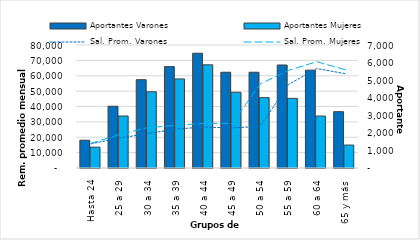
| Category | Aportantes Varones | Aportantes Mujeres |
|---|---|---|
| Hasta 24 | 1581 | 1187 |
| 25 a 29 | 3515 | 2960 |
| 30 a 34 | 5026 | 4337 |
| 35 a 39 | 5770 | 5069 |
| 40 a 44 | 6532 | 5872 |
| 45 a 49 | 5449 | 4311 |
| 50 a 54 | 5450 | 4003 |
| 55 a 59 | 5861 | 3963 |
| 60 a 64 | 5570 | 2956 |
| 65 y más | 3206 | 1307 |